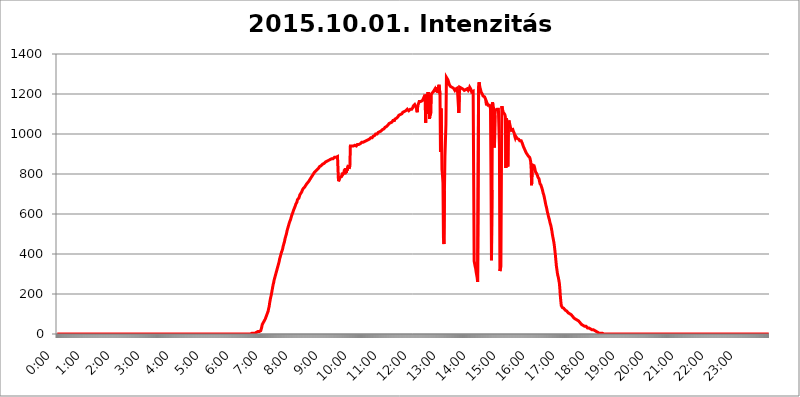
| Category | 2015.10.01. Intenzitás [W/m^2] |
|---|---|
| 0.0 | 0 |
| 0.0006944444444444445 | 0 |
| 0.001388888888888889 | 0 |
| 0.0020833333333333333 | 0 |
| 0.002777777777777778 | 0 |
| 0.003472222222222222 | 0 |
| 0.004166666666666667 | 0 |
| 0.004861111111111111 | 0 |
| 0.005555555555555556 | 0 |
| 0.0062499999999999995 | 0 |
| 0.006944444444444444 | 0 |
| 0.007638888888888889 | 0 |
| 0.008333333333333333 | 0 |
| 0.009027777777777779 | 0 |
| 0.009722222222222222 | 0 |
| 0.010416666666666666 | 0 |
| 0.011111111111111112 | 0 |
| 0.011805555555555555 | 0 |
| 0.012499999999999999 | 0 |
| 0.013194444444444444 | 0 |
| 0.013888888888888888 | 0 |
| 0.014583333333333332 | 0 |
| 0.015277777777777777 | 0 |
| 0.015972222222222224 | 0 |
| 0.016666666666666666 | 0 |
| 0.017361111111111112 | 0 |
| 0.018055555555555557 | 0 |
| 0.01875 | 0 |
| 0.019444444444444445 | 0 |
| 0.02013888888888889 | 0 |
| 0.020833333333333332 | 0 |
| 0.02152777777777778 | 0 |
| 0.022222222222222223 | 0 |
| 0.02291666666666667 | 0 |
| 0.02361111111111111 | 0 |
| 0.024305555555555556 | 0 |
| 0.024999999999999998 | 0 |
| 0.025694444444444447 | 0 |
| 0.02638888888888889 | 0 |
| 0.027083333333333334 | 0 |
| 0.027777777777777776 | 0 |
| 0.02847222222222222 | 0 |
| 0.029166666666666664 | 0 |
| 0.029861111111111113 | 0 |
| 0.030555555555555555 | 0 |
| 0.03125 | 0 |
| 0.03194444444444445 | 0 |
| 0.03263888888888889 | 0 |
| 0.03333333333333333 | 0 |
| 0.034027777777777775 | 0 |
| 0.034722222222222224 | 0 |
| 0.035416666666666666 | 0 |
| 0.036111111111111115 | 0 |
| 0.03680555555555556 | 0 |
| 0.0375 | 0 |
| 0.03819444444444444 | 0 |
| 0.03888888888888889 | 0 |
| 0.03958333333333333 | 0 |
| 0.04027777777777778 | 0 |
| 0.04097222222222222 | 0 |
| 0.041666666666666664 | 0 |
| 0.042361111111111106 | 0 |
| 0.04305555555555556 | 0 |
| 0.043750000000000004 | 0 |
| 0.044444444444444446 | 0 |
| 0.04513888888888889 | 0 |
| 0.04583333333333334 | 0 |
| 0.04652777777777778 | 0 |
| 0.04722222222222222 | 0 |
| 0.04791666666666666 | 0 |
| 0.04861111111111111 | 0 |
| 0.049305555555555554 | 0 |
| 0.049999999999999996 | 0 |
| 0.05069444444444445 | 0 |
| 0.051388888888888894 | 0 |
| 0.052083333333333336 | 0 |
| 0.05277777777777778 | 0 |
| 0.05347222222222222 | 0 |
| 0.05416666666666667 | 0 |
| 0.05486111111111111 | 0 |
| 0.05555555555555555 | 0 |
| 0.05625 | 0 |
| 0.05694444444444444 | 0 |
| 0.057638888888888885 | 0 |
| 0.05833333333333333 | 0 |
| 0.05902777777777778 | 0 |
| 0.059722222222222225 | 0 |
| 0.06041666666666667 | 0 |
| 0.061111111111111116 | 0 |
| 0.06180555555555556 | 0 |
| 0.0625 | 0 |
| 0.06319444444444444 | 0 |
| 0.06388888888888888 | 0 |
| 0.06458333333333334 | 0 |
| 0.06527777777777778 | 0 |
| 0.06597222222222222 | 0 |
| 0.06666666666666667 | 0 |
| 0.06736111111111111 | 0 |
| 0.06805555555555555 | 0 |
| 0.06874999999999999 | 0 |
| 0.06944444444444443 | 0 |
| 0.07013888888888889 | 0 |
| 0.07083333333333333 | 0 |
| 0.07152777777777779 | 0 |
| 0.07222222222222223 | 0 |
| 0.07291666666666667 | 0 |
| 0.07361111111111111 | 0 |
| 0.07430555555555556 | 0 |
| 0.075 | 0 |
| 0.07569444444444444 | 0 |
| 0.0763888888888889 | 0 |
| 0.07708333333333334 | 0 |
| 0.07777777777777778 | 0 |
| 0.07847222222222222 | 0 |
| 0.07916666666666666 | 0 |
| 0.0798611111111111 | 0 |
| 0.08055555555555556 | 0 |
| 0.08125 | 0 |
| 0.08194444444444444 | 0 |
| 0.08263888888888889 | 0 |
| 0.08333333333333333 | 0 |
| 0.08402777777777777 | 0 |
| 0.08472222222222221 | 0 |
| 0.08541666666666665 | 0 |
| 0.08611111111111112 | 0 |
| 0.08680555555555557 | 0 |
| 0.08750000000000001 | 0 |
| 0.08819444444444445 | 0 |
| 0.08888888888888889 | 0 |
| 0.08958333333333333 | 0 |
| 0.09027777777777778 | 0 |
| 0.09097222222222222 | 0 |
| 0.09166666666666667 | 0 |
| 0.09236111111111112 | 0 |
| 0.09305555555555556 | 0 |
| 0.09375 | 0 |
| 0.09444444444444444 | 0 |
| 0.09513888888888888 | 0 |
| 0.09583333333333333 | 0 |
| 0.09652777777777777 | 0 |
| 0.09722222222222222 | 0 |
| 0.09791666666666667 | 0 |
| 0.09861111111111111 | 0 |
| 0.09930555555555555 | 0 |
| 0.09999999999999999 | 0 |
| 0.10069444444444443 | 0 |
| 0.1013888888888889 | 0 |
| 0.10208333333333335 | 0 |
| 0.10277777777777779 | 0 |
| 0.10347222222222223 | 0 |
| 0.10416666666666667 | 0 |
| 0.10486111111111111 | 0 |
| 0.10555555555555556 | 0 |
| 0.10625 | 0 |
| 0.10694444444444444 | 0 |
| 0.1076388888888889 | 0 |
| 0.10833333333333334 | 0 |
| 0.10902777777777778 | 0 |
| 0.10972222222222222 | 0 |
| 0.1111111111111111 | 0 |
| 0.11180555555555556 | 0 |
| 0.11180555555555556 | 0 |
| 0.1125 | 0 |
| 0.11319444444444444 | 0 |
| 0.11388888888888889 | 0 |
| 0.11458333333333333 | 0 |
| 0.11527777777777777 | 0 |
| 0.11597222222222221 | 0 |
| 0.11666666666666665 | 0 |
| 0.1173611111111111 | 0 |
| 0.11805555555555557 | 0 |
| 0.11944444444444445 | 0 |
| 0.12013888888888889 | 0 |
| 0.12083333333333333 | 0 |
| 0.12152777777777778 | 0 |
| 0.12222222222222223 | 0 |
| 0.12291666666666667 | 0 |
| 0.12291666666666667 | 0 |
| 0.12361111111111112 | 0 |
| 0.12430555555555556 | 0 |
| 0.125 | 0 |
| 0.12569444444444444 | 0 |
| 0.12638888888888888 | 0 |
| 0.12708333333333333 | 0 |
| 0.16875 | 0 |
| 0.12847222222222224 | 0 |
| 0.12916666666666668 | 0 |
| 0.12986111111111112 | 0 |
| 0.13055555555555556 | 0 |
| 0.13125 | 0 |
| 0.13194444444444445 | 0 |
| 0.1326388888888889 | 0 |
| 0.13333333333333333 | 0 |
| 0.13402777777777777 | 0 |
| 0.13402777777777777 | 0 |
| 0.13472222222222222 | 0 |
| 0.13541666666666666 | 0 |
| 0.1361111111111111 | 0 |
| 0.13749999999999998 | 0 |
| 0.13819444444444443 | 0 |
| 0.1388888888888889 | 0 |
| 0.13958333333333334 | 0 |
| 0.14027777777777778 | 0 |
| 0.14097222222222222 | 0 |
| 0.14166666666666666 | 0 |
| 0.1423611111111111 | 0 |
| 0.14305555555555557 | 0 |
| 0.14375000000000002 | 0 |
| 0.14444444444444446 | 0 |
| 0.1451388888888889 | 0 |
| 0.1451388888888889 | 0 |
| 0.14652777777777778 | 0 |
| 0.14722222222222223 | 0 |
| 0.14791666666666667 | 0 |
| 0.1486111111111111 | 0 |
| 0.14930555555555555 | 0 |
| 0.15 | 0 |
| 0.15069444444444444 | 0 |
| 0.15138888888888888 | 0 |
| 0.15208333333333332 | 0 |
| 0.15277777777777776 | 0 |
| 0.15347222222222223 | 0 |
| 0.15416666666666667 | 0 |
| 0.15486111111111112 | 0 |
| 0.15555555555555556 | 0 |
| 0.15625 | 0 |
| 0.15694444444444444 | 0 |
| 0.15763888888888888 | 0 |
| 0.15833333333333333 | 0 |
| 0.15902777777777777 | 0 |
| 0.15972222222222224 | 0 |
| 0.16041666666666668 | 0 |
| 0.16111111111111112 | 0 |
| 0.16180555555555556 | 0 |
| 0.1625 | 0 |
| 0.16319444444444445 | 0 |
| 0.1638888888888889 | 0 |
| 0.16458333333333333 | 0 |
| 0.16527777777777777 | 0 |
| 0.16597222222222222 | 0 |
| 0.16666666666666666 | 0 |
| 0.1673611111111111 | 0 |
| 0.16805555555555554 | 0 |
| 0.16874999999999998 | 0 |
| 0.16944444444444443 | 0 |
| 0.17013888888888887 | 0 |
| 0.1708333333333333 | 0 |
| 0.17152777777777775 | 0 |
| 0.17222222222222225 | 0 |
| 0.1729166666666667 | 0 |
| 0.17361111111111113 | 0 |
| 0.17430555555555557 | 0 |
| 0.17500000000000002 | 0 |
| 0.17569444444444446 | 0 |
| 0.1763888888888889 | 0 |
| 0.17708333333333334 | 0 |
| 0.17777777777777778 | 0 |
| 0.17847222222222223 | 0 |
| 0.17916666666666667 | 0 |
| 0.1798611111111111 | 0 |
| 0.18055555555555555 | 0 |
| 0.18125 | 0 |
| 0.18194444444444444 | 0 |
| 0.1826388888888889 | 0 |
| 0.18333333333333335 | 0 |
| 0.1840277777777778 | 0 |
| 0.18472222222222223 | 0 |
| 0.18541666666666667 | 0 |
| 0.18611111111111112 | 0 |
| 0.18680555555555556 | 0 |
| 0.1875 | 0 |
| 0.18819444444444444 | 0 |
| 0.18888888888888888 | 0 |
| 0.18958333333333333 | 0 |
| 0.19027777777777777 | 0 |
| 0.1909722222222222 | 0 |
| 0.19166666666666665 | 0 |
| 0.19236111111111112 | 0 |
| 0.19305555555555554 | 0 |
| 0.19375 | 0 |
| 0.19444444444444445 | 0 |
| 0.1951388888888889 | 0 |
| 0.19583333333333333 | 0 |
| 0.19652777777777777 | 0 |
| 0.19722222222222222 | 0 |
| 0.19791666666666666 | 0 |
| 0.1986111111111111 | 0 |
| 0.19930555555555554 | 0 |
| 0.19999999999999998 | 0 |
| 0.20069444444444443 | 0 |
| 0.20138888888888887 | 0 |
| 0.2020833333333333 | 0 |
| 0.2027777777777778 | 0 |
| 0.2034722222222222 | 0 |
| 0.2041666666666667 | 0 |
| 0.20486111111111113 | 0 |
| 0.20555555555555557 | 0 |
| 0.20625000000000002 | 0 |
| 0.20694444444444446 | 0 |
| 0.2076388888888889 | 0 |
| 0.20833333333333334 | 0 |
| 0.20902777777777778 | 0 |
| 0.20972222222222223 | 0 |
| 0.21041666666666667 | 0 |
| 0.2111111111111111 | 0 |
| 0.21180555555555555 | 0 |
| 0.2125 | 0 |
| 0.21319444444444444 | 0 |
| 0.2138888888888889 | 0 |
| 0.21458333333333335 | 0 |
| 0.2152777777777778 | 0 |
| 0.21597222222222223 | 0 |
| 0.21666666666666667 | 0 |
| 0.21736111111111112 | 0 |
| 0.21805555555555556 | 0 |
| 0.21875 | 0 |
| 0.21944444444444444 | 0 |
| 0.22013888888888888 | 0 |
| 0.22083333333333333 | 0 |
| 0.22152777777777777 | 0 |
| 0.2222222222222222 | 0 |
| 0.22291666666666665 | 0 |
| 0.2236111111111111 | 0 |
| 0.22430555555555556 | 0 |
| 0.225 | 0 |
| 0.22569444444444445 | 0 |
| 0.2263888888888889 | 0 |
| 0.22708333333333333 | 0 |
| 0.22777777777777777 | 0 |
| 0.22847222222222222 | 0 |
| 0.22916666666666666 | 0 |
| 0.2298611111111111 | 0 |
| 0.23055555555555554 | 0 |
| 0.23124999999999998 | 0 |
| 0.23194444444444443 | 0 |
| 0.23263888888888887 | 0 |
| 0.2333333333333333 | 0 |
| 0.2340277777777778 | 0 |
| 0.2347222222222222 | 0 |
| 0.2354166666666667 | 0 |
| 0.23611111111111113 | 0 |
| 0.23680555555555557 | 0 |
| 0.23750000000000002 | 0 |
| 0.23819444444444446 | 0 |
| 0.2388888888888889 | 0 |
| 0.23958333333333334 | 0 |
| 0.24027777777777778 | 0 |
| 0.24097222222222223 | 0 |
| 0.24166666666666667 | 0 |
| 0.2423611111111111 | 0 |
| 0.24305555555555555 | 0 |
| 0.24375 | 0 |
| 0.24444444444444446 | 0 |
| 0.24513888888888888 | 0 |
| 0.24583333333333335 | 0 |
| 0.2465277777777778 | 0 |
| 0.24722222222222223 | 0 |
| 0.24791666666666667 | 0 |
| 0.24861111111111112 | 0 |
| 0.24930555555555556 | 0 |
| 0.25 | 0 |
| 0.25069444444444444 | 0 |
| 0.2513888888888889 | 0 |
| 0.2520833333333333 | 0 |
| 0.25277777777777777 | 0 |
| 0.2534722222222222 | 0 |
| 0.25416666666666665 | 0 |
| 0.2548611111111111 | 0 |
| 0.2555555555555556 | 0 |
| 0.25625000000000003 | 0 |
| 0.2569444444444445 | 0 |
| 0.2576388888888889 | 0 |
| 0.25833333333333336 | 0 |
| 0.2590277777777778 | 0 |
| 0.25972222222222224 | 0 |
| 0.2604166666666667 | 0 |
| 0.2611111111111111 | 0 |
| 0.26180555555555557 | 0 |
| 0.2625 | 0 |
| 0.26319444444444445 | 0 |
| 0.2638888888888889 | 0 |
| 0.26458333333333334 | 0 |
| 0.2652777777777778 | 0 |
| 0.2659722222222222 | 0 |
| 0.26666666666666666 | 0 |
| 0.2673611111111111 | 0 |
| 0.26805555555555555 | 0 |
| 0.26875 | 0 |
| 0.26944444444444443 | 0 |
| 0.2701388888888889 | 0 |
| 0.2708333333333333 | 0 |
| 0.27152777777777776 | 0 |
| 0.2722222222222222 | 0 |
| 0.27291666666666664 | 3.525 |
| 0.2736111111111111 | 3.525 |
| 0.2743055555555555 | 3.525 |
| 0.27499999999999997 | 3.525 |
| 0.27569444444444446 | 3.525 |
| 0.27638888888888885 | 3.525 |
| 0.27708333333333335 | 3.525 |
| 0.2777777777777778 | 7.887 |
| 0.27847222222222223 | 7.887 |
| 0.2791666666666667 | 7.887 |
| 0.2798611111111111 | 7.887 |
| 0.28055555555555556 | 7.887 |
| 0.28125 | 12.257 |
| 0.28194444444444444 | 12.257 |
| 0.2826388888888889 | 12.257 |
| 0.2833333333333333 | 12.257 |
| 0.28402777777777777 | 12.257 |
| 0.2847222222222222 | 16.636 |
| 0.28541666666666665 | 16.636 |
| 0.28611111111111115 | 21.024 |
| 0.28680555555555554 | 34.234 |
| 0.28750000000000003 | 47.511 |
| 0.2881944444444445 | 51.951 |
| 0.2888888888888889 | 56.398 |
| 0.28958333333333336 | 60.85 |
| 0.2902777777777778 | 65.31 |
| 0.29097222222222224 | 69.775 |
| 0.2916666666666667 | 74.246 |
| 0.2923611111111111 | 78.722 |
| 0.29305555555555557 | 87.692 |
| 0.29375 | 92.184 |
| 0.29444444444444445 | 101.184 |
| 0.2951388888888889 | 105.69 |
| 0.29583333333333334 | 114.716 |
| 0.2965277777777778 | 128.284 |
| 0.2972222222222222 | 137.347 |
| 0.29791666666666666 | 155.509 |
| 0.2986111111111111 | 169.156 |
| 0.29930555555555555 | 182.82 |
| 0.3 | 191.937 |
| 0.30069444444444443 | 205.62 |
| 0.3013888888888889 | 219.309 |
| 0.3020833333333333 | 233 |
| 0.30277777777777776 | 246.689 |
| 0.3034722222222222 | 255.813 |
| 0.30416666666666664 | 269.49 |
| 0.3048611111111111 | 278.603 |
| 0.3055555555555555 | 287.709 |
| 0.30624999999999997 | 296.808 |
| 0.3069444444444444 | 305.898 |
| 0.3076388888888889 | 314.98 |
| 0.30833333333333335 | 324.052 |
| 0.3090277777777778 | 333.113 |
| 0.30972222222222223 | 342.162 |
| 0.3104166666666667 | 351.198 |
| 0.3111111111111111 | 360.221 |
| 0.31180555555555556 | 373.729 |
| 0.3125 | 378.224 |
| 0.31319444444444444 | 391.685 |
| 0.3138888888888889 | 396.164 |
| 0.3145833333333333 | 409.574 |
| 0.31527777777777777 | 414.035 |
| 0.3159722222222222 | 422.943 |
| 0.31666666666666665 | 436.27 |
| 0.31736111111111115 | 445.129 |
| 0.31805555555555554 | 453.968 |
| 0.31875000000000003 | 462.786 |
| 0.3194444444444445 | 475.972 |
| 0.3201388888888889 | 484.735 |
| 0.32083333333333336 | 493.475 |
| 0.3215277777777778 | 502.192 |
| 0.32222222222222224 | 515.223 |
| 0.3229166666666667 | 519.555 |
| 0.3236111111111111 | 532.513 |
| 0.32430555555555557 | 541.121 |
| 0.325 | 549.704 |
| 0.32569444444444445 | 558.261 |
| 0.3263888888888889 | 562.53 |
| 0.32708333333333334 | 571.049 |
| 0.3277777777777778 | 579.542 |
| 0.3284722222222222 | 588.009 |
| 0.32916666666666666 | 596.45 |
| 0.3298611111111111 | 600.661 |
| 0.33055555555555555 | 609.062 |
| 0.33125 | 617.436 |
| 0.33194444444444443 | 621.613 |
| 0.3326388888888889 | 629.948 |
| 0.3333333333333333 | 634.105 |
| 0.3340277777777778 | 642.4 |
| 0.3347222222222222 | 650.667 |
| 0.3354166666666667 | 654.791 |
| 0.3361111111111111 | 658.909 |
| 0.3368055555555556 | 671.22 |
| 0.33749999999999997 | 671.22 |
| 0.33819444444444446 | 675.311 |
| 0.33888888888888885 | 679.395 |
| 0.33958333333333335 | 687.544 |
| 0.34027777777777773 | 695.666 |
| 0.34097222222222223 | 695.666 |
| 0.3416666666666666 | 703.762 |
| 0.3423611111111111 | 703.762 |
| 0.3430555555555555 | 711.832 |
| 0.34375 | 719.877 |
| 0.3444444444444445 | 723.889 |
| 0.3451388888888889 | 727.896 |
| 0.3458333333333334 | 727.896 |
| 0.34652777777777777 | 731.896 |
| 0.34722222222222227 | 735.89 |
| 0.34791666666666665 | 739.877 |
| 0.34861111111111115 | 743.859 |
| 0.34930555555555554 | 747.834 |
| 0.35000000000000003 | 751.803 |
| 0.3506944444444444 | 751.803 |
| 0.3513888888888889 | 755.766 |
| 0.3520833333333333 | 759.723 |
| 0.3527777777777778 | 763.674 |
| 0.3534722222222222 | 767.62 |
| 0.3541666666666667 | 771.559 |
| 0.3548611111111111 | 775.492 |
| 0.35555555555555557 | 779.42 |
| 0.35625 | 783.342 |
| 0.35694444444444445 | 787.258 |
| 0.3576388888888889 | 791.169 |
| 0.35833333333333334 | 791.169 |
| 0.3590277777777778 | 798.974 |
| 0.3597222222222222 | 802.868 |
| 0.36041666666666666 | 806.757 |
| 0.3611111111111111 | 806.757 |
| 0.36180555555555555 | 810.641 |
| 0.3625 | 814.519 |
| 0.36319444444444443 | 818.392 |
| 0.3638888888888889 | 818.392 |
| 0.3645833333333333 | 822.26 |
| 0.3652777777777778 | 822.26 |
| 0.3659722222222222 | 826.123 |
| 0.3666666666666667 | 829.981 |
| 0.3673611111111111 | 829.981 |
| 0.3680555555555556 | 837.682 |
| 0.36874999999999997 | 837.682 |
| 0.36944444444444446 | 837.682 |
| 0.37013888888888885 | 841.526 |
| 0.37083333333333335 | 845.365 |
| 0.37152777777777773 | 845.365 |
| 0.37222222222222223 | 849.199 |
| 0.3729166666666666 | 849.199 |
| 0.3736111111111111 | 853.029 |
| 0.3743055555555555 | 853.029 |
| 0.375 | 853.029 |
| 0.3756944444444445 | 853.029 |
| 0.3763888888888889 | 860.676 |
| 0.3770833333333334 | 860.676 |
| 0.37777777777777777 | 860.676 |
| 0.37847222222222227 | 864.493 |
| 0.37916666666666665 | 864.493 |
| 0.37986111111111115 | 864.493 |
| 0.38055555555555554 | 868.305 |
| 0.38125000000000003 | 868.305 |
| 0.3819444444444444 | 868.305 |
| 0.3826388888888889 | 872.114 |
| 0.3833333333333333 | 872.114 |
| 0.3840277777777778 | 872.114 |
| 0.3847222222222222 | 875.918 |
| 0.3854166666666667 | 875.918 |
| 0.3861111111111111 | 875.918 |
| 0.38680555555555557 | 875.918 |
| 0.3875 | 875.918 |
| 0.38819444444444445 | 875.918 |
| 0.3888888888888889 | 883.516 |
| 0.38958333333333334 | 883.516 |
| 0.3902777777777778 | 879.719 |
| 0.3909722222222222 | 883.516 |
| 0.39166666666666666 | 883.516 |
| 0.3923611111111111 | 887.309 |
| 0.39305555555555555 | 887.309 |
| 0.39375 | 883.516 |
| 0.39444444444444443 | 763.674 |
| 0.3951388888888889 | 767.62 |
| 0.3958333333333333 | 763.674 |
| 0.3965277777777778 | 783.342 |
| 0.3972222222222222 | 787.258 |
| 0.3979166666666667 | 783.342 |
| 0.3986111111111111 | 787.258 |
| 0.3993055555555556 | 795.074 |
| 0.39999999999999997 | 806.757 |
| 0.40069444444444446 | 798.974 |
| 0.40138888888888885 | 798.974 |
| 0.40208333333333335 | 806.757 |
| 0.40277777777777773 | 822.26 |
| 0.40347222222222223 | 798.974 |
| 0.4041666666666666 | 829.981 |
| 0.4048611111111111 | 818.392 |
| 0.4055555555555555 | 806.757 |
| 0.40625 | 826.123 |
| 0.4069444444444445 | 818.392 |
| 0.4076388888888889 | 837.682 |
| 0.4083333333333334 | 845.365 |
| 0.40902777777777777 | 826.123 |
| 0.40972222222222227 | 829.981 |
| 0.41041666666666665 | 841.526 |
| 0.41111111111111115 | 940.082 |
| 0.41180555555555554 | 940.082 |
| 0.41250000000000003 | 940.082 |
| 0.4131944444444444 | 940.082 |
| 0.4138888888888889 | 940.082 |
| 0.4145833333333333 | 943.832 |
| 0.4152777777777778 | 940.082 |
| 0.4159722222222222 | 943.832 |
| 0.4166666666666667 | 940.082 |
| 0.4173611111111111 | 943.832 |
| 0.41805555555555557 | 943.832 |
| 0.41875 | 943.832 |
| 0.41944444444444445 | 940.082 |
| 0.4201388888888889 | 943.832 |
| 0.42083333333333334 | 947.58 |
| 0.4215277777777778 | 947.58 |
| 0.4222222222222222 | 951.327 |
| 0.42291666666666666 | 947.58 |
| 0.4236111111111111 | 947.58 |
| 0.42430555555555555 | 951.327 |
| 0.425 | 951.327 |
| 0.42569444444444443 | 955.071 |
| 0.4263888888888889 | 955.071 |
| 0.4270833333333333 | 958.814 |
| 0.4277777777777778 | 958.814 |
| 0.4284722222222222 | 958.814 |
| 0.4291666666666667 | 958.814 |
| 0.4298611111111111 | 962.555 |
| 0.4305555555555556 | 962.555 |
| 0.43124999999999997 | 962.555 |
| 0.43194444444444446 | 966.295 |
| 0.43263888888888885 | 962.555 |
| 0.43333333333333335 | 966.295 |
| 0.43402777777777773 | 966.295 |
| 0.43472222222222223 | 966.295 |
| 0.4354166666666666 | 970.034 |
| 0.4361111111111111 | 970.034 |
| 0.4368055555555555 | 970.034 |
| 0.4375 | 973.772 |
| 0.4381944444444445 | 973.772 |
| 0.4388888888888889 | 977.508 |
| 0.4395833333333334 | 981.244 |
| 0.44027777777777777 | 981.244 |
| 0.44097222222222227 | 977.508 |
| 0.44166666666666665 | 981.244 |
| 0.44236111111111115 | 984.98 |
| 0.44305555555555554 | 988.714 |
| 0.44375000000000003 | 992.448 |
| 0.4444444444444444 | 992.448 |
| 0.4451388888888889 | 992.448 |
| 0.4458333333333333 | 996.182 |
| 0.4465277777777778 | 999.916 |
| 0.4472222222222222 | 999.916 |
| 0.4479166666666667 | 999.916 |
| 0.4486111111111111 | 999.916 |
| 0.44930555555555557 | 1003.65 |
| 0.45 | 1007.383 |
| 0.45069444444444445 | 1007.383 |
| 0.4513888888888889 | 1007.383 |
| 0.45208333333333334 | 1011.118 |
| 0.4527777777777778 | 1014.852 |
| 0.4534722222222222 | 1014.852 |
| 0.45416666666666666 | 1014.852 |
| 0.4548611111111111 | 1018.587 |
| 0.45555555555555555 | 1018.587 |
| 0.45625 | 1022.323 |
| 0.45694444444444443 | 1022.323 |
| 0.4576388888888889 | 1022.323 |
| 0.4583333333333333 | 1026.06 |
| 0.4590277777777778 | 1029.798 |
| 0.4597222222222222 | 1033.537 |
| 0.4604166666666667 | 1037.277 |
| 0.4611111111111111 | 1037.277 |
| 0.4618055555555556 | 1037.277 |
| 0.46249999999999997 | 1041.019 |
| 0.46319444444444446 | 1041.019 |
| 0.46388888888888885 | 1044.762 |
| 0.46458333333333335 | 1048.508 |
| 0.46527777777777773 | 1052.255 |
| 0.46597222222222223 | 1052.255 |
| 0.4666666666666666 | 1052.255 |
| 0.4673611111111111 | 1056.004 |
| 0.4680555555555555 | 1056.004 |
| 0.46875 | 1059.756 |
| 0.4694444444444445 | 1059.756 |
| 0.4701388888888889 | 1063.51 |
| 0.4708333333333334 | 1067.267 |
| 0.47152777777777777 | 1071.027 |
| 0.47222222222222227 | 1067.267 |
| 0.47291666666666665 | 1067.267 |
| 0.47361111111111115 | 1074.789 |
| 0.47430555555555554 | 1078.555 |
| 0.47500000000000003 | 1078.555 |
| 0.4756944444444444 | 1078.555 |
| 0.4763888888888889 | 1082.324 |
| 0.4770833333333333 | 1082.324 |
| 0.4777777777777778 | 1086.097 |
| 0.4784722222222222 | 1089.873 |
| 0.4791666666666667 | 1093.653 |
| 0.4798611111111111 | 1093.653 |
| 0.48055555555555557 | 1093.653 |
| 0.48125 | 1097.437 |
| 0.48194444444444445 | 1097.437 |
| 0.4826388888888889 | 1097.437 |
| 0.48333333333333334 | 1101.226 |
| 0.4840277777777778 | 1105.019 |
| 0.4847222222222222 | 1108.816 |
| 0.48541666666666666 | 1108.816 |
| 0.4861111111111111 | 1112.618 |
| 0.48680555555555555 | 1112.618 |
| 0.4875 | 1112.618 |
| 0.48819444444444443 | 1116.426 |
| 0.4888888888888889 | 1116.426 |
| 0.4895833333333333 | 1116.426 |
| 0.4902777777777778 | 1120.238 |
| 0.4909722222222222 | 1124.056 |
| 0.4916666666666667 | 1124.056 |
| 0.4923611111111111 | 1124.056 |
| 0.4930555555555556 | 1116.426 |
| 0.49374999999999997 | 1116.426 |
| 0.49444444444444446 | 1116.426 |
| 0.49513888888888885 | 1124.056 |
| 0.49583333333333335 | 1127.879 |
| 0.49652777777777773 | 1124.056 |
| 0.49722222222222223 | 1124.056 |
| 0.4979166666666666 | 1127.879 |
| 0.4986111111111111 | 1131.708 |
| 0.4993055555555555 | 1139.384 |
| 0.5 | 1139.384 |
| 0.5006944444444444 | 1143.232 |
| 0.5013888888888889 | 1147.086 |
| 0.5020833333333333 | 1147.086 |
| 0.5027777777777778 | 1147.086 |
| 0.5034722222222222 | 1131.708 |
| 0.5041666666666667 | 1127.879 |
| 0.5048611111111111 | 1108.816 |
| 0.5055555555555555 | 1139.384 |
| 0.50625 | 1147.086 |
| 0.5069444444444444 | 1154.814 |
| 0.5076388888888889 | 1162.571 |
| 0.5083333333333333 | 1162.571 |
| 0.5090277777777777 | 1162.571 |
| 0.5097222222222222 | 1162.571 |
| 0.5104166666666666 | 1162.571 |
| 0.5111111111111112 | 1166.46 |
| 0.5118055555555555 | 1166.46 |
| 0.5125000000000001 | 1170.358 |
| 0.5131944444444444 | 1174.263 |
| 0.513888888888889 | 1178.177 |
| 0.5145833333333333 | 1186.03 |
| 0.5152777777777778 | 1189.969 |
| 0.5159722222222222 | 1178.177 |
| 0.5166666666666667 | 1056.004 |
| 0.517361111111111 | 1197.876 |
| 0.5180555555555556 | 1197.876 |
| 0.5187499999999999 | 1101.226 |
| 0.5194444444444445 | 1097.437 |
| 0.5201388888888888 | 1209.807 |
| 0.5208333333333334 | 1213.804 |
| 0.5215277777777778 | 1147.086 |
| 0.5222222222222223 | 1074.789 |
| 0.5229166666666667 | 1147.086 |
| 0.5236111111111111 | 1093.653 |
| 0.5243055555555556 | 1189.969 |
| 0.525 | 1201.843 |
| 0.5256944444444445 | 1201.843 |
| 0.5263888888888889 | 1205.82 |
| 0.5270833333333333 | 1209.807 |
| 0.5277777777777778 | 1209.807 |
| 0.5284722222222222 | 1217.812 |
| 0.5291666666666667 | 1221.83 |
| 0.5298611111111111 | 1225.859 |
| 0.5305555555555556 | 1221.83 |
| 0.53125 | 1209.807 |
| 0.5319444444444444 | 1225.859 |
| 0.5326388888888889 | 1233.951 |
| 0.5333333333333333 | 1233.951 |
| 0.5340277777777778 | 1205.82 |
| 0.5347222222222222 | 1238.014 |
| 0.5354166666666667 | 1246.176 |
| 0.5361111111111111 | 1242.089 |
| 0.5368055555555555 | 1197.876 |
| 0.5375 | 909.996 |
| 0.5381944444444444 | 1127.879 |
| 0.5388888888888889 | 1026.06 |
| 0.5395833333333333 | 822.26 |
| 0.5402777777777777 | 795.074 |
| 0.5409722222222222 | 755.766 |
| 0.5416666666666666 | 480.356 |
| 0.5423611111111112 | 449.551 |
| 0.5430555555555555 | 715.858 |
| 0.5437500000000001 | 887.309 |
| 0.5444444444444444 | 966.295 |
| 0.545138888888889 | 1048.508 |
| 0.5458333333333333 | 1283.541 |
| 0.5465277777777778 | 1283.541 |
| 0.5472222222222222 | 1279.334 |
| 0.5479166666666667 | 1270.964 |
| 0.548611111111111 | 1262.649 |
| 0.5493055555555556 | 1254.387 |
| 0.5499999999999999 | 1246.176 |
| 0.5506944444444445 | 1242.089 |
| 0.5513888888888888 | 1238.014 |
| 0.5520833333333334 | 1242.089 |
| 0.5527777777777778 | 1238.014 |
| 0.5534722222222223 | 1233.951 |
| 0.5541666666666667 | 1233.951 |
| 0.5548611111111111 | 1233.951 |
| 0.5555555555555556 | 1229.899 |
| 0.55625 | 1225.859 |
| 0.5569444444444445 | 1225.859 |
| 0.5576388888888889 | 1217.812 |
| 0.5583333333333333 | 1221.83 |
| 0.5590277777777778 | 1225.859 |
| 0.5597222222222222 | 1225.859 |
| 0.5604166666666667 | 1225.859 |
| 0.5611111111111111 | 1229.899 |
| 0.5618055555555556 | 1233.951 |
| 0.5625 | 1229.899 |
| 0.5631944444444444 | 1105.019 |
| 0.5638888888888889 | 1189.969 |
| 0.5645833333333333 | 1233.951 |
| 0.5652777777777778 | 1233.951 |
| 0.5659722222222222 | 1229.899 |
| 0.5666666666666667 | 1229.899 |
| 0.5673611111111111 | 1225.859 |
| 0.5680555555555555 | 1225.859 |
| 0.56875 | 1225.859 |
| 0.5694444444444444 | 1225.859 |
| 0.5701388888888889 | 1221.83 |
| 0.5708333333333333 | 1217.812 |
| 0.5715277777777777 | 1217.812 |
| 0.5722222222222222 | 1221.83 |
| 0.5729166666666666 | 1221.83 |
| 0.5736111111111112 | 1221.83 |
| 0.5743055555555555 | 1221.83 |
| 0.5750000000000001 | 1225.859 |
| 0.5756944444444444 | 1225.859 |
| 0.576388888888889 | 1217.812 |
| 0.5770833333333333 | 1217.812 |
| 0.5777777777777778 | 1225.859 |
| 0.5784722222222222 | 1233.951 |
| 0.5791666666666667 | 1229.899 |
| 0.579861111111111 | 1225.859 |
| 0.5805555555555556 | 1221.83 |
| 0.5812499999999999 | 1209.807 |
| 0.5819444444444445 | 1213.804 |
| 0.5826388888888888 | 1213.804 |
| 0.5833333333333334 | 1213.804 |
| 0.5840277777777778 | 791.169 |
| 0.5847222222222223 | 364.728 |
| 0.5854166666666667 | 351.198 |
| 0.5861111111111111 | 337.639 |
| 0.5868055555555556 | 328.584 |
| 0.5875 | 310.44 |
| 0.5881944444444445 | 296.808 |
| 0.5888888888888889 | 283.156 |
| 0.5895833333333333 | 260.373 |
| 0.5902777777777778 | 260.373 |
| 0.5909722222222222 | 1238.014 |
| 0.5916666666666667 | 1258.511 |
| 0.5923611111111111 | 1242.089 |
| 0.5930555555555556 | 1229.899 |
| 0.59375 | 1221.83 |
| 0.5944444444444444 | 1209.807 |
| 0.5951388888888889 | 1205.82 |
| 0.5958333333333333 | 1201.843 |
| 0.5965277777777778 | 1197.876 |
| 0.5972222222222222 | 1189.969 |
| 0.5979166666666667 | 1189.969 |
| 0.5986111111111111 | 1189.969 |
| 0.5993055555555555 | 1186.03 |
| 0.6 | 1182.099 |
| 0.6006944444444444 | 1174.263 |
| 0.6013888888888889 | 1158.689 |
| 0.6020833333333333 | 1143.232 |
| 0.6027777777777777 | 1154.814 |
| 0.6034722222222222 | 1150.946 |
| 0.6041666666666666 | 1143.232 |
| 0.6048611111111112 | 1143.232 |
| 0.6055555555555555 | 1143.232 |
| 0.6062500000000001 | 1143.232 |
| 0.6069444444444444 | 1139.384 |
| 0.607638888888889 | 1127.879 |
| 0.6083333333333333 | 798.974 |
| 0.6090277777777778 | 369.23 |
| 0.6097222222222222 | 719.877 |
| 0.6104166666666667 | 1158.689 |
| 0.611111111111111 | 1147.086 |
| 0.6118055555555556 | 1131.708 |
| 0.6124999999999999 | 1105.019 |
| 0.6131944444444445 | 932.576 |
| 0.6138888888888888 | 1093.653 |
| 0.6145833333333334 | 1120.238 |
| 0.6152777777777778 | 1120.238 |
| 0.6159722222222223 | 1116.426 |
| 0.6166666666666667 | 1124.056 |
| 0.6173611111111111 | 1120.238 |
| 0.6180555555555556 | 1120.238 |
| 0.61875 | 1124.056 |
| 0.6194444444444445 | 1120.238 |
| 0.6201388888888889 | 940.082 |
| 0.6208333333333333 | 314.98 |
| 0.6215277777777778 | 324.052 |
| 0.6222222222222222 | 337.639 |
| 0.6229166666666667 | 779.42 |
| 0.6236111111111111 | 1139.384 |
| 0.6243055555555556 | 1124.056 |
| 0.625 | 1120.238 |
| 0.6256944444444444 | 1108.816 |
| 0.6263888888888889 | 1112.618 |
| 0.6270833333333333 | 1108.816 |
| 0.6277777777777778 | 1097.437 |
| 0.6284722222222222 | 1086.097 |
| 0.6291666666666667 | 829.981 |
| 0.6298611111111111 | 1078.555 |
| 0.6305555555555555 | 1067.267 |
| 0.63125 | 1052.255 |
| 0.6319444444444444 | 837.682 |
| 0.6326388888888889 | 1022.323 |
| 0.6333333333333333 | 1067.267 |
| 0.6340277777777777 | 1059.756 |
| 0.6347222222222222 | 1048.508 |
| 0.6354166666666666 | 1044.762 |
| 0.6361111111111112 | 1026.06 |
| 0.6368055555555555 | 1018.587 |
| 0.6375000000000001 | 1022.323 |
| 0.6381944444444444 | 1022.323 |
| 0.638888888888889 | 1022.323 |
| 0.6395833333333333 | 1014.852 |
| 0.6402777777777778 | 1011.118 |
| 0.6409722222222222 | 1003.65 |
| 0.6416666666666667 | 988.714 |
| 0.642361111111111 | 981.244 |
| 0.6430555555555556 | 988.714 |
| 0.6437499999999999 | 988.714 |
| 0.6444444444444445 | 984.98 |
| 0.6451388888888888 | 977.508 |
| 0.6458333333333334 | 981.244 |
| 0.6465277777777778 | 977.508 |
| 0.6472222222222223 | 973.772 |
| 0.6479166666666667 | 970.034 |
| 0.6486111111111111 | 966.295 |
| 0.6493055555555556 | 966.295 |
| 0.65 | 966.295 |
| 0.6506944444444445 | 966.295 |
| 0.6513888888888889 | 962.555 |
| 0.6520833333333333 | 955.071 |
| 0.6527777777777778 | 947.58 |
| 0.6534722222222222 | 940.082 |
| 0.6541666666666667 | 936.33 |
| 0.6548611111111111 | 928.819 |
| 0.6555555555555556 | 925.06 |
| 0.65625 | 917.534 |
| 0.6569444444444444 | 913.766 |
| 0.6576388888888889 | 906.223 |
| 0.6583333333333333 | 902.447 |
| 0.6590277777777778 | 898.668 |
| 0.6597222222222222 | 894.885 |
| 0.6604166666666667 | 891.099 |
| 0.6611111111111111 | 887.309 |
| 0.6618055555555555 | 887.309 |
| 0.6625 | 883.516 |
| 0.6631944444444444 | 875.918 |
| 0.6638888888888889 | 864.493 |
| 0.6645833333333333 | 833.834 |
| 0.6652777777777777 | 743.859 |
| 0.6659722222222222 | 814.519 |
| 0.6666666666666666 | 845.365 |
| 0.6673611111111111 | 849.199 |
| 0.6680555555555556 | 845.365 |
| 0.6687500000000001 | 841.526 |
| 0.6694444444444444 | 833.834 |
| 0.6701388888888888 | 822.26 |
| 0.6708333333333334 | 810.641 |
| 0.6715277777777778 | 806.757 |
| 0.6722222222222222 | 802.868 |
| 0.6729166666666666 | 798.974 |
| 0.6736111111111112 | 791.169 |
| 0.6743055555555556 | 783.342 |
| 0.6749999999999999 | 779.42 |
| 0.6756944444444444 | 775.492 |
| 0.6763888888888889 | 763.674 |
| 0.6770833333333334 | 751.803 |
| 0.6777777777777777 | 747.834 |
| 0.6784722222222223 | 743.859 |
| 0.6791666666666667 | 735.89 |
| 0.6798611111111111 | 731.896 |
| 0.6805555555555555 | 719.877 |
| 0.68125 | 707.8 |
| 0.6819444444444445 | 699.717 |
| 0.6826388888888889 | 691.608 |
| 0.6833333333333332 | 679.395 |
| 0.6840277777777778 | 667.123 |
| 0.6847222222222222 | 654.791 |
| 0.6854166666666667 | 642.4 |
| 0.686111111111111 | 634.105 |
| 0.6868055555555556 | 621.613 |
| 0.6875 | 609.062 |
| 0.6881944444444444 | 600.661 |
| 0.688888888888889 | 588.009 |
| 0.6895833333333333 | 579.542 |
| 0.6902777777777778 | 571.049 |
| 0.6909722222222222 | 558.261 |
| 0.6916666666666668 | 549.704 |
| 0.6923611111111111 | 541.121 |
| 0.6930555555555555 | 528.2 |
| 0.69375 | 515.223 |
| 0.6944444444444445 | 497.836 |
| 0.6951388888888889 | 484.735 |
| 0.6958333333333333 | 471.582 |
| 0.6965277777777777 | 458.38 |
| 0.6972222222222223 | 440.702 |
| 0.6979166666666666 | 418.492 |
| 0.6986111111111111 | 396.164 |
| 0.6993055555555556 | 369.23 |
| 0.7000000000000001 | 342.162 |
| 0.7006944444444444 | 324.052 |
| 0.7013888888888888 | 305.898 |
| 0.7020833333333334 | 292.259 |
| 0.7027777777777778 | 283.156 |
| 0.7034722222222222 | 269.49 |
| 0.7041666666666666 | 255.813 |
| 0.7048611111111112 | 228.436 |
| 0.7055555555555556 | 191.937 |
| 0.7062499999999999 | 164.605 |
| 0.7069444444444444 | 141.884 |
| 0.7076388888888889 | 137.347 |
| 0.7083333333333334 | 132.814 |
| 0.7090277777777777 | 132.814 |
| 0.7097222222222223 | 128.284 |
| 0.7104166666666667 | 128.284 |
| 0.7111111111111111 | 123.758 |
| 0.7118055555555555 | 123.758 |
| 0.7125 | 119.235 |
| 0.7131944444444445 | 119.235 |
| 0.7138888888888889 | 114.716 |
| 0.7145833333333332 | 114.716 |
| 0.7152777777777778 | 110.201 |
| 0.7159722222222222 | 110.201 |
| 0.7166666666666667 | 105.69 |
| 0.717361111111111 | 105.69 |
| 0.7180555555555556 | 101.184 |
| 0.71875 | 101.184 |
| 0.7194444444444444 | 101.184 |
| 0.720138888888889 | 96.682 |
| 0.7208333333333333 | 96.682 |
| 0.7215277777777778 | 92.184 |
| 0.7222222222222222 | 92.184 |
| 0.7229166666666668 | 87.692 |
| 0.7236111111111111 | 87.692 |
| 0.7243055555555555 | 83.205 |
| 0.725 | 78.722 |
| 0.7256944444444445 | 78.722 |
| 0.7263888888888889 | 74.246 |
| 0.7270833333333333 | 74.246 |
| 0.7277777777777777 | 74.246 |
| 0.7284722222222223 | 69.775 |
| 0.7291666666666666 | 69.775 |
| 0.7298611111111111 | 65.31 |
| 0.7305555555555556 | 65.31 |
| 0.7312500000000001 | 65.31 |
| 0.7319444444444444 | 60.85 |
| 0.7326388888888888 | 60.85 |
| 0.7333333333333334 | 56.398 |
| 0.7340277777777778 | 56.398 |
| 0.7347222222222222 | 51.951 |
| 0.7354166666666666 | 47.511 |
| 0.7361111111111112 | 47.511 |
| 0.7368055555555556 | 47.511 |
| 0.7374999999999999 | 43.079 |
| 0.7381944444444444 | 43.079 |
| 0.7388888888888889 | 43.079 |
| 0.7395833333333334 | 38.653 |
| 0.7402777777777777 | 38.653 |
| 0.7409722222222223 | 38.653 |
| 0.7416666666666667 | 38.653 |
| 0.7423611111111111 | 34.234 |
| 0.7430555555555555 | 34.234 |
| 0.74375 | 29.823 |
| 0.7444444444444445 | 29.823 |
| 0.7451388888888889 | 29.823 |
| 0.7458333333333332 | 29.823 |
| 0.7465277777777778 | 25.419 |
| 0.7472222222222222 | 25.419 |
| 0.7479166666666667 | 25.419 |
| 0.748611111111111 | 25.419 |
| 0.7493055555555556 | 21.024 |
| 0.75 | 21.024 |
| 0.7506944444444444 | 21.024 |
| 0.751388888888889 | 21.024 |
| 0.7520833333333333 | 21.024 |
| 0.7527777777777778 | 16.636 |
| 0.7534722222222222 | 16.636 |
| 0.7541666666666668 | 16.636 |
| 0.7548611111111111 | 12.257 |
| 0.7555555555555555 | 12.257 |
| 0.75625 | 12.257 |
| 0.7569444444444445 | 12.257 |
| 0.7576388888888889 | 7.887 |
| 0.7583333333333333 | 7.887 |
| 0.7590277777777777 | 7.887 |
| 0.7597222222222223 | 7.887 |
| 0.7604166666666666 | 3.525 |
| 0.7611111111111111 | 3.525 |
| 0.7618055555555556 | 3.525 |
| 0.7625000000000001 | 3.525 |
| 0.7631944444444444 | 3.525 |
| 0.7638888888888888 | 3.525 |
| 0.7645833333333334 | 3.525 |
| 0.7652777777777778 | 0 |
| 0.7659722222222222 | 0 |
| 0.7666666666666666 | 0 |
| 0.7673611111111112 | 0 |
| 0.7680555555555556 | 0 |
| 0.7687499999999999 | 0 |
| 0.7694444444444444 | 0 |
| 0.7701388888888889 | 0 |
| 0.7708333333333334 | 0 |
| 0.7715277777777777 | 0 |
| 0.7722222222222223 | 0 |
| 0.7729166666666667 | 0 |
| 0.7736111111111111 | 0 |
| 0.7743055555555555 | 0 |
| 0.775 | 0 |
| 0.7756944444444445 | 0 |
| 0.7763888888888889 | 0 |
| 0.7770833333333332 | 0 |
| 0.7777777777777778 | 0 |
| 0.7784722222222222 | 0 |
| 0.7791666666666667 | 0 |
| 0.779861111111111 | 0 |
| 0.7805555555555556 | 0 |
| 0.78125 | 0 |
| 0.7819444444444444 | 0 |
| 0.782638888888889 | 0 |
| 0.7833333333333333 | 0 |
| 0.7840277777777778 | 0 |
| 0.7847222222222222 | 0 |
| 0.7854166666666668 | 0 |
| 0.7861111111111111 | 0 |
| 0.7868055555555555 | 0 |
| 0.7875 | 0 |
| 0.7881944444444445 | 0 |
| 0.7888888888888889 | 0 |
| 0.7895833333333333 | 0 |
| 0.7902777777777777 | 0 |
| 0.7909722222222223 | 0 |
| 0.7916666666666666 | 0 |
| 0.7923611111111111 | 0 |
| 0.7930555555555556 | 0 |
| 0.7937500000000001 | 0 |
| 0.7944444444444444 | 0 |
| 0.7951388888888888 | 0 |
| 0.7958333333333334 | 0 |
| 0.7965277777777778 | 0 |
| 0.7972222222222222 | 0 |
| 0.7979166666666666 | 0 |
| 0.7986111111111112 | 0 |
| 0.7993055555555556 | 0 |
| 0.7999999999999999 | 0 |
| 0.8006944444444444 | 0 |
| 0.8013888888888889 | 0 |
| 0.8020833333333334 | 0 |
| 0.8027777777777777 | 0 |
| 0.8034722222222223 | 0 |
| 0.8041666666666667 | 0 |
| 0.8048611111111111 | 0 |
| 0.8055555555555555 | 0 |
| 0.80625 | 0 |
| 0.8069444444444445 | 0 |
| 0.8076388888888889 | 0 |
| 0.8083333333333332 | 0 |
| 0.8090277777777778 | 0 |
| 0.8097222222222222 | 0 |
| 0.8104166666666667 | 0 |
| 0.811111111111111 | 0 |
| 0.8118055555555556 | 0 |
| 0.8125 | 0 |
| 0.8131944444444444 | 0 |
| 0.813888888888889 | 0 |
| 0.8145833333333333 | 0 |
| 0.8152777777777778 | 0 |
| 0.8159722222222222 | 0 |
| 0.8166666666666668 | 0 |
| 0.8173611111111111 | 0 |
| 0.8180555555555555 | 0 |
| 0.81875 | 0 |
| 0.8194444444444445 | 0 |
| 0.8201388888888889 | 0 |
| 0.8208333333333333 | 0 |
| 0.8215277777777777 | 0 |
| 0.8222222222222223 | 0 |
| 0.8229166666666666 | 0 |
| 0.8236111111111111 | 0 |
| 0.8243055555555556 | 0 |
| 0.8250000000000001 | 0 |
| 0.8256944444444444 | 0 |
| 0.8263888888888888 | 0 |
| 0.8270833333333334 | 0 |
| 0.8277777777777778 | 0 |
| 0.8284722222222222 | 0 |
| 0.8291666666666666 | 0 |
| 0.8298611111111112 | 0 |
| 0.8305555555555556 | 0 |
| 0.8312499999999999 | 0 |
| 0.8319444444444444 | 0 |
| 0.8326388888888889 | 0 |
| 0.8333333333333334 | 0 |
| 0.8340277777777777 | 0 |
| 0.8347222222222223 | 0 |
| 0.8354166666666667 | 0 |
| 0.8361111111111111 | 0 |
| 0.8368055555555555 | 0 |
| 0.8375 | 0 |
| 0.8381944444444445 | 0 |
| 0.8388888888888889 | 0 |
| 0.8395833333333332 | 0 |
| 0.8402777777777778 | 0 |
| 0.8409722222222222 | 0 |
| 0.8416666666666667 | 0 |
| 0.842361111111111 | 0 |
| 0.8430555555555556 | 0 |
| 0.84375 | 0 |
| 0.8444444444444444 | 0 |
| 0.845138888888889 | 0 |
| 0.8458333333333333 | 0 |
| 0.8465277777777778 | 0 |
| 0.8472222222222222 | 0 |
| 0.8479166666666668 | 0 |
| 0.8486111111111111 | 0 |
| 0.8493055555555555 | 0 |
| 0.85 | 0 |
| 0.8506944444444445 | 0 |
| 0.8513888888888889 | 0 |
| 0.8520833333333333 | 0 |
| 0.8527777777777777 | 0 |
| 0.8534722222222223 | 0 |
| 0.8541666666666666 | 0 |
| 0.8548611111111111 | 0 |
| 0.8555555555555556 | 0 |
| 0.8562500000000001 | 0 |
| 0.8569444444444444 | 0 |
| 0.8576388888888888 | 0 |
| 0.8583333333333334 | 0 |
| 0.8590277777777778 | 0 |
| 0.8597222222222222 | 0 |
| 0.8604166666666666 | 0 |
| 0.8611111111111112 | 0 |
| 0.8618055555555556 | 0 |
| 0.8624999999999999 | 0 |
| 0.8631944444444444 | 0 |
| 0.8638888888888889 | 0 |
| 0.8645833333333334 | 0 |
| 0.8652777777777777 | 0 |
| 0.8659722222222223 | 0 |
| 0.8666666666666667 | 0 |
| 0.8673611111111111 | 0 |
| 0.8680555555555555 | 0 |
| 0.86875 | 0 |
| 0.8694444444444445 | 0 |
| 0.8701388888888889 | 0 |
| 0.8708333333333332 | 0 |
| 0.8715277777777778 | 0 |
| 0.8722222222222222 | 0 |
| 0.8729166666666667 | 0 |
| 0.873611111111111 | 0 |
| 0.8743055555555556 | 0 |
| 0.875 | 0 |
| 0.8756944444444444 | 0 |
| 0.876388888888889 | 0 |
| 0.8770833333333333 | 0 |
| 0.8777777777777778 | 0 |
| 0.8784722222222222 | 0 |
| 0.8791666666666668 | 0 |
| 0.8798611111111111 | 0 |
| 0.8805555555555555 | 0 |
| 0.88125 | 0 |
| 0.8819444444444445 | 0 |
| 0.8826388888888889 | 0 |
| 0.8833333333333333 | 0 |
| 0.8840277777777777 | 0 |
| 0.8847222222222223 | 0 |
| 0.8854166666666666 | 0 |
| 0.8861111111111111 | 0 |
| 0.8868055555555556 | 0 |
| 0.8875000000000001 | 0 |
| 0.8881944444444444 | 0 |
| 0.8888888888888888 | 0 |
| 0.8895833333333334 | 0 |
| 0.8902777777777778 | 0 |
| 0.8909722222222222 | 0 |
| 0.8916666666666666 | 0 |
| 0.8923611111111112 | 0 |
| 0.8930555555555556 | 0 |
| 0.8937499999999999 | 0 |
| 0.8944444444444444 | 0 |
| 0.8951388888888889 | 0 |
| 0.8958333333333334 | 0 |
| 0.8965277777777777 | 0 |
| 0.8972222222222223 | 0 |
| 0.8979166666666667 | 0 |
| 0.8986111111111111 | 0 |
| 0.8993055555555555 | 0 |
| 0.9 | 0 |
| 0.9006944444444445 | 0 |
| 0.9013888888888889 | 0 |
| 0.9020833333333332 | 0 |
| 0.9027777777777778 | 0 |
| 0.9034722222222222 | 0 |
| 0.9041666666666667 | 0 |
| 0.904861111111111 | 0 |
| 0.9055555555555556 | 0 |
| 0.90625 | 0 |
| 0.9069444444444444 | 0 |
| 0.907638888888889 | 0 |
| 0.9083333333333333 | 0 |
| 0.9090277777777778 | 0 |
| 0.9097222222222222 | 0 |
| 0.9104166666666668 | 0 |
| 0.9111111111111111 | 0 |
| 0.9118055555555555 | 0 |
| 0.9125 | 0 |
| 0.9131944444444445 | 0 |
| 0.9138888888888889 | 0 |
| 0.9145833333333333 | 0 |
| 0.9152777777777777 | 0 |
| 0.9159722222222223 | 0 |
| 0.9166666666666666 | 0 |
| 0.9173611111111111 | 0 |
| 0.9180555555555556 | 0 |
| 0.9187500000000001 | 0 |
| 0.9194444444444444 | 0 |
| 0.9201388888888888 | 0 |
| 0.9208333333333334 | 0 |
| 0.9215277777777778 | 0 |
| 0.9222222222222222 | 0 |
| 0.9229166666666666 | 0 |
| 0.9236111111111112 | 0 |
| 0.9243055555555556 | 0 |
| 0.9249999999999999 | 0 |
| 0.9256944444444444 | 0 |
| 0.9263888888888889 | 0 |
| 0.9270833333333334 | 0 |
| 0.9277777777777777 | 0 |
| 0.9284722222222223 | 0 |
| 0.9291666666666667 | 0 |
| 0.9298611111111111 | 0 |
| 0.9305555555555555 | 0 |
| 0.93125 | 0 |
| 0.9319444444444445 | 0 |
| 0.9326388888888889 | 0 |
| 0.9333333333333332 | 0 |
| 0.9340277777777778 | 0 |
| 0.9347222222222222 | 0 |
| 0.9354166666666667 | 0 |
| 0.936111111111111 | 0 |
| 0.9368055555555556 | 0 |
| 0.9375 | 0 |
| 0.9381944444444444 | 0 |
| 0.938888888888889 | 0 |
| 0.9395833333333333 | 0 |
| 0.9402777777777778 | 0 |
| 0.9409722222222222 | 0 |
| 0.9416666666666668 | 0 |
| 0.9423611111111111 | 0 |
| 0.9430555555555555 | 0 |
| 0.94375 | 0 |
| 0.9444444444444445 | 0 |
| 0.9451388888888889 | 0 |
| 0.9458333333333333 | 0 |
| 0.9465277777777777 | 0 |
| 0.9472222222222223 | 0 |
| 0.9479166666666666 | 0 |
| 0.9486111111111111 | 0 |
| 0.9493055555555556 | 0 |
| 0.9500000000000001 | 0 |
| 0.9506944444444444 | 0 |
| 0.9513888888888888 | 0 |
| 0.9520833333333334 | 0 |
| 0.9527777777777778 | 0 |
| 0.9534722222222222 | 0 |
| 0.9541666666666666 | 0 |
| 0.9548611111111112 | 0 |
| 0.9555555555555556 | 0 |
| 0.9562499999999999 | 0 |
| 0.9569444444444444 | 0 |
| 0.9576388888888889 | 0 |
| 0.9583333333333334 | 0 |
| 0.9590277777777777 | 0 |
| 0.9597222222222223 | 0 |
| 0.9604166666666667 | 0 |
| 0.9611111111111111 | 0 |
| 0.9618055555555555 | 0 |
| 0.9625 | 0 |
| 0.9631944444444445 | 0 |
| 0.9638888888888889 | 0 |
| 0.9645833333333332 | 0 |
| 0.9652777777777778 | 0 |
| 0.9659722222222222 | 0 |
| 0.9666666666666667 | 0 |
| 0.967361111111111 | 0 |
| 0.9680555555555556 | 0 |
| 0.96875 | 0 |
| 0.9694444444444444 | 0 |
| 0.970138888888889 | 0 |
| 0.9708333333333333 | 0 |
| 0.9715277777777778 | 0 |
| 0.9722222222222222 | 0 |
| 0.9729166666666668 | 0 |
| 0.9736111111111111 | 0 |
| 0.9743055555555555 | 0 |
| 0.975 | 0 |
| 0.9756944444444445 | 0 |
| 0.9763888888888889 | 0 |
| 0.9770833333333333 | 0 |
| 0.9777777777777777 | 0 |
| 0.9784722222222223 | 0 |
| 0.9791666666666666 | 0 |
| 0.9798611111111111 | 0 |
| 0.9805555555555556 | 0 |
| 0.9812500000000001 | 0 |
| 0.9819444444444444 | 0 |
| 0.9826388888888888 | 0 |
| 0.9833333333333334 | 0 |
| 0.9840277777777778 | 0 |
| 0.9847222222222222 | 0 |
| 0.9854166666666666 | 0 |
| 0.9861111111111112 | 0 |
| 0.9868055555555556 | 0 |
| 0.9874999999999999 | 0 |
| 0.9881944444444444 | 0 |
| 0.9888888888888889 | 0 |
| 0.9895833333333334 | 0 |
| 0.9902777777777777 | 0 |
| 0.9909722222222223 | 0 |
| 0.9916666666666667 | 0 |
| 0.9923611111111111 | 0 |
| 0.9930555555555555 | 0 |
| 0.99375 | 0 |
| 0.9944444444444445 | 0 |
| 0.9951388888888889 | 0 |
| 0.9958333333333332 | 0 |
| 0.9965277777777778 | 0 |
| 0.9972222222222222 | 0 |
| 0.9979166666666667 | 0 |
| 0.998611111111111 | 0 |
| 0.9993055555555556 | 0 |